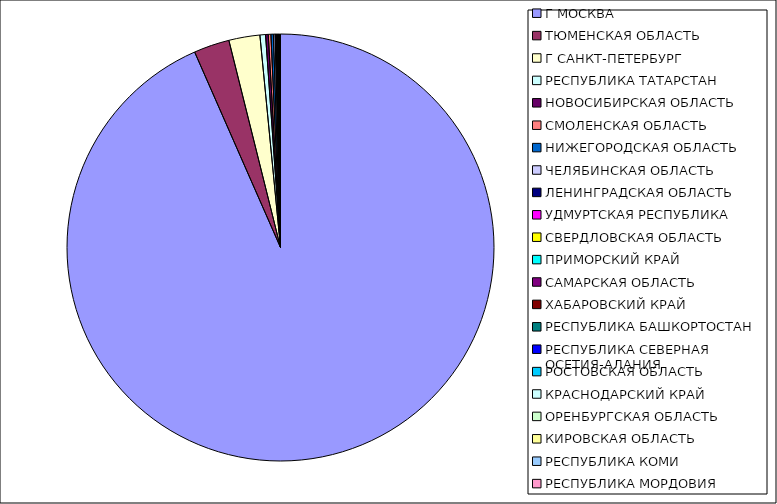
| Category | Оборот |
|---|---|
| Г МОСКВА | 0.934 |
| ТЮМЕНСКАЯ ОБЛАСТЬ | 0.027 |
| Г САНКТ-ПЕТЕРБУРГ | 0.023 |
| РЕСПУБЛИКА ТАТАРСТАН | 0.004 |
| НОВОСИБИРСКАЯ ОБЛАСТЬ | 0.002 |
| СМОЛЕНСКАЯ ОБЛАСТЬ | 0.002 |
| НИЖЕГОРОДСКАЯ ОБЛАСТЬ | 0.002 |
| ЧЕЛЯБИНСКАЯ ОБЛАСТЬ | 0.001 |
| ЛЕНИНГРАДСКАЯ ОБЛАСТЬ | 0.001 |
| УДМУРТСКАЯ РЕСПУБЛИКА | 0.001 |
| СВЕРДЛОВСКАЯ ОБЛАСТЬ | 0.001 |
| ПРИМОРСКИЙ КРАЙ | 0 |
| САМАРСКАЯ ОБЛАСТЬ | 0 |
| ХАБАРОВСКИЙ КРАЙ | 0 |
| РЕСПУБЛИКА БАШКОРТОСТАН | 0 |
| РЕСПУБЛИКА СЕВЕРНАЯ ОСЕТИЯ-АЛАНИЯ | 0 |
| РОСТОВСКАЯ ОБЛАСТЬ | 0 |
| КРАСНОДАРСКИЙ КРАЙ | 0 |
| ОРЕНБУРГСКАЯ ОБЛАСТЬ | 0 |
| КИРОВСКАЯ ОБЛАСТЬ | 0 |
| РЕСПУБЛИКА КОМИ | 0 |
| РЕСПУБЛИКА МОРДОВИЯ | 0 |
| ИРКУТСКАЯ ОБЛАСТЬ | 0 |
| СТАВРОПОЛЬСКИЙ КРАЙ | 0 |
| ПЕРМСКИЙ КРАЙ | 0 |
| КАБАРДИНО-БАЛКАРСКАЯ РЕСПУБЛИКА | 0 |
| САРАТОВСКАЯ ОБЛАСТЬ | 0 |